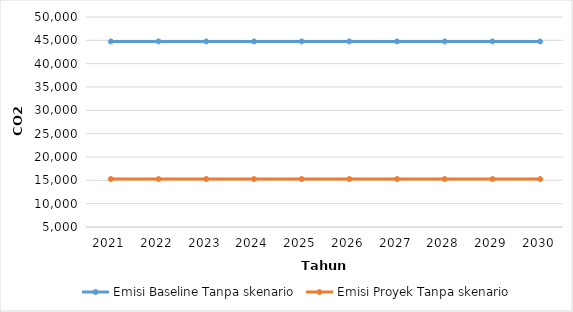
| Category | Emisi Baseline Tanpa skenario | Emisi Proyek Tanpa skenario |
|---|---|---|
| 2021.0 | 44767.798 | 15282.073 |
| 2022.0 | 44767.798 | 15282.073 |
| 2023.0 | 44767.798 | 15282.073 |
| 2024.0 | 44767.798 | 15282.073 |
| 2025.0 | 44767.798 | 15282.073 |
| 2026.0 | 44767.798 | 15282.073 |
| 2027.0 | 44767.798 | 15282.073 |
| 2028.0 | 44767.798 | 15282.073 |
| 2029.0 | 44767.798 | 15282.073 |
| 2030.0 | 44767.798 | 15282.073 |